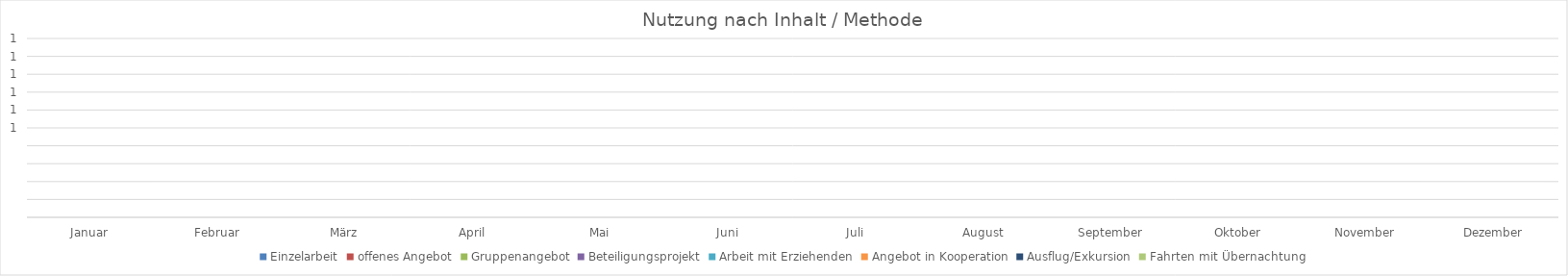
| Category | Einzelarbeit | offenes Angebot | Gruppenangebot | Beteiligungsprojekt | Arbeit mit Erziehenden | Angebot in Kooperation | Ausflug/Exkursion | Fahrten mit Übernachtung |
|---|---|---|---|---|---|---|---|---|
| Januar | 0 | 0 | 0 | 0 | 0 | 0 | 0 | 0 |
| Februar | 0 | 0 | 0 | 0 | 0 | 0 | 0 | 0 |
| März | 0 | 0 | 0 | 0 | 0 | 0 | 0 | 0 |
| April | 0 | 0 | 0 | 0 | 0 | 0 | 0 | 0 |
| Mai | 0 | 0 | 0 | 0 | 0 | 0 | 0 | 0 |
| Juni | 0 | 0 | 0 | 0 | 0 | 0 | 0 | 0 |
| Juli | 0 | 0 | 0 | 0 | 0 | 0 | 0 | 0 |
| August | 0 | 0 | 0 | 0 | 0 | 0 | 0 | 0 |
| September | 0 | 0 | 0 | 0 | 0 | 0 | 0 | 0 |
| Oktober | 0 | 0 | 0 | 0 | 0 | 0 | 0 | 0 |
| November | 0 | 0 | 0 | 0 | 0 | 0 | 0 | 0 |
| Dezember | 0 | 0 | 0 | 0 | 0 | 0 | 0 | 0 |